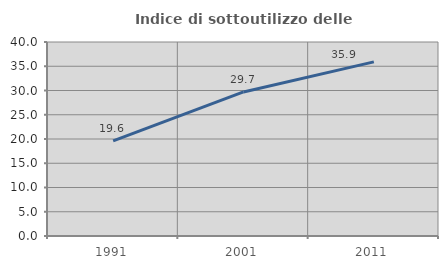
| Category | Indice di sottoutilizzo delle abitazioni  |
|---|---|
| 1991.0 | 19.595 |
| 2001.0 | 29.706 |
| 2011.0 | 35.905 |